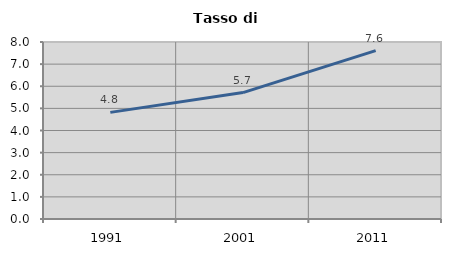
| Category | Tasso di disoccupazione   |
|---|---|
| 1991.0 | 4.819 |
| 2001.0 | 5.714 |
| 2011.0 | 7.609 |